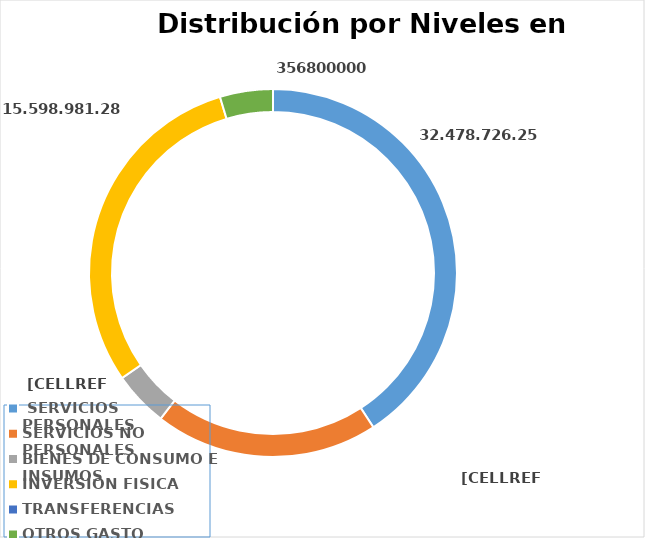
| Category | Series 0 | Series 1 |
|---|---|---|
|  SERVICIOS PERSONALES |  | 31293075159 |
| SERVICIOS NO PERSONALES |  | 15051524351 |
| BIENES DE CONSUMO E INSUMOS |  | 3730349948 |
| INVERSIÓN FISICA |  | 23011313475 |
| TRANSFERENCIAS |  | 0 |
| OTROS GASTO |  | 3568000000 |